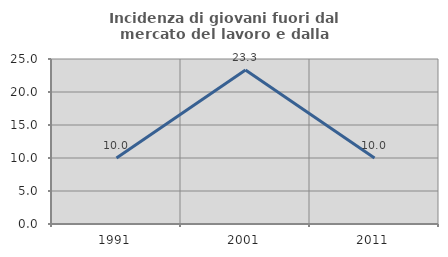
| Category | Incidenza di giovani fuori dal mercato del lavoro e dalla formazione  |
|---|---|
| 1991.0 | 10 |
| 2001.0 | 23.333 |
| 2011.0 | 10 |